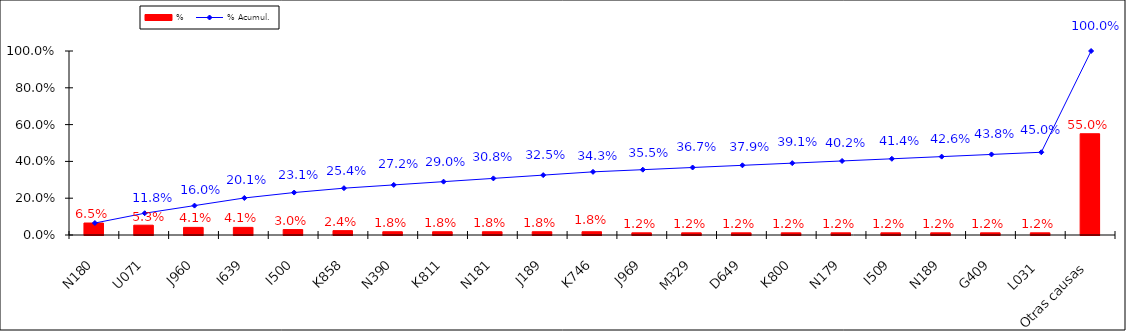
| Category | % |
|---|---|
| N180 | 0.065 |
| U071 | 0.053 |
| J960 | 0.041 |
| I639 | 0.041 |
| I500 | 0.03 |
| K858 | 0.024 |
| N390 | 0.018 |
| K811 | 0.018 |
| N181 | 0.018 |
| J189 | 0.018 |
| K746 | 0.018 |
| J969 | 0.012 |
| M329 | 0.012 |
| D649 | 0.012 |
| K800 | 0.012 |
| N179 | 0.012 |
| I509 | 0.012 |
| N189 | 0.012 |
| G409 | 0.012 |
| L031 | 0.012 |
| Otras causas | 0.55 |